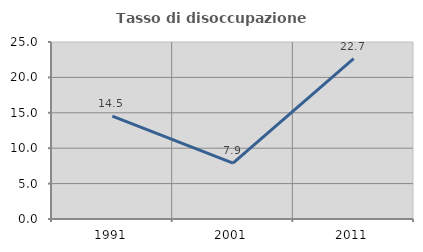
| Category | Tasso di disoccupazione giovanile  |
|---|---|
| 1991.0 | 14.523 |
| 2001.0 | 7.879 |
| 2011.0 | 22.656 |